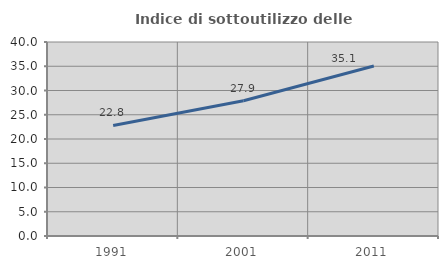
| Category | Indice di sottoutilizzo delle abitazioni  |
|---|---|
| 1991.0 | 22.799 |
| 2001.0 | 27.888 |
| 2011.0 | 35.065 |